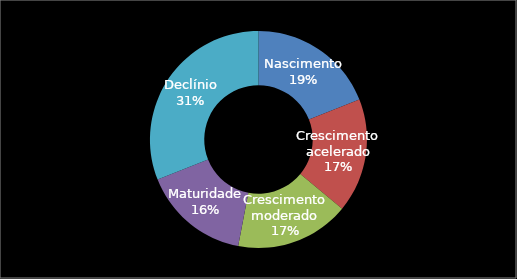
| Category | Series 0 |
|---|---|
| Nascimento | 0.19 |
| Crescimento acelerado | 0.17 |
| Crescimento moderado | 0.17 |
| Maturidade | 0.16 |
| Declínio | 0.31 |